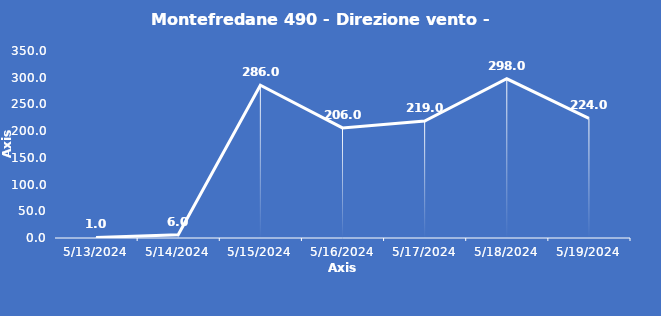
| Category | Montefredane 490 - Direzione vento - Grezzo (°N) |
|---|---|
| 5/13/24 | 1 |
| 5/14/24 | 6 |
| 5/15/24 | 286 |
| 5/16/24 | 206 |
| 5/17/24 | 219 |
| 5/18/24 | 298 |
| 5/19/24 | 224 |